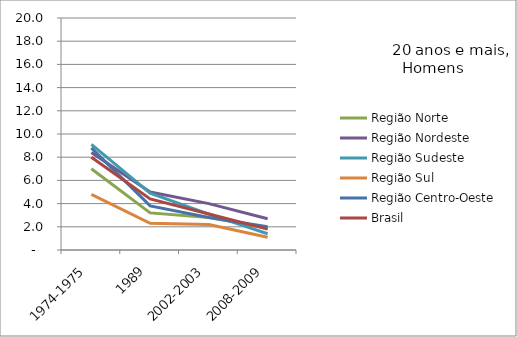
| Category | Região Norte | Região Nordeste | Região Sudeste | Região Sul | Região Centro-Oeste | Brasil |
|---|---|---|---|---|---|---|
| 1974-1975 | 7 | 8.4 | 9.1 | 4.8 | 8.8 | 8 |
| 1989 | 3.2 | 5 | 4.9 | 2.3 | 3.8 | 4.4 |
| 2002-2003 | 2.8 | 4 | 3.1 | 2.2 | 2.8 | 3.1 |
| 2008-2009 | 1.9 | 2.7 | 1.4 | 1.1 | 2 | 1.8 |